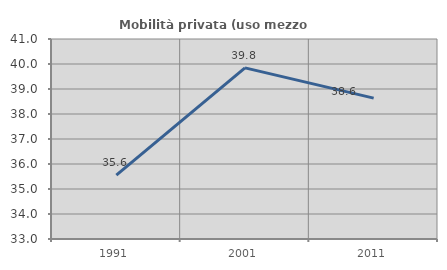
| Category | Mobilità privata (uso mezzo privato) |
|---|---|
| 1991.0 | 35.556 |
| 2001.0 | 39.844 |
| 2011.0 | 38.636 |